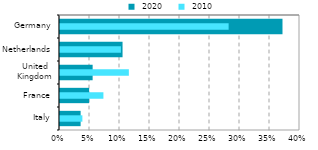
| Category |  2020 |
|---|---|
| Italy | 0.034 |
| France | 0.049 |
| United
Kingdom | 0.054 |
| Netherlands | 0.104 |
| Germany | 0.371 |